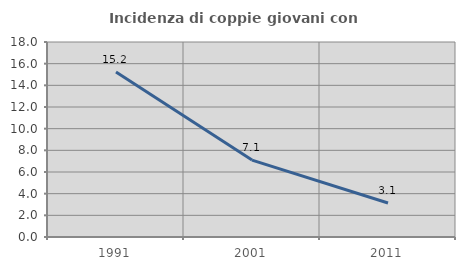
| Category | Incidenza di coppie giovani con figli |
|---|---|
| 1991.0 | 15.238 |
| 2001.0 | 7.099 |
| 2011.0 | 3.135 |